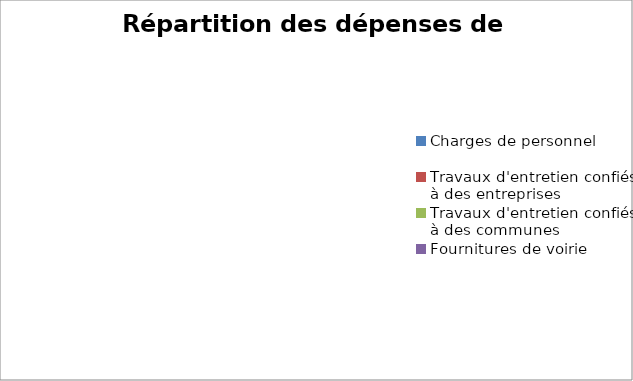
| Category | Series 0 |
|---|---|
| Charges de personnel | 0 |
| Travaux d'entretien confiés à des entreprises | 0 |
| Travaux d'entretien confiés à des communes | 0 |
| Fournitures de voirie | 0 |